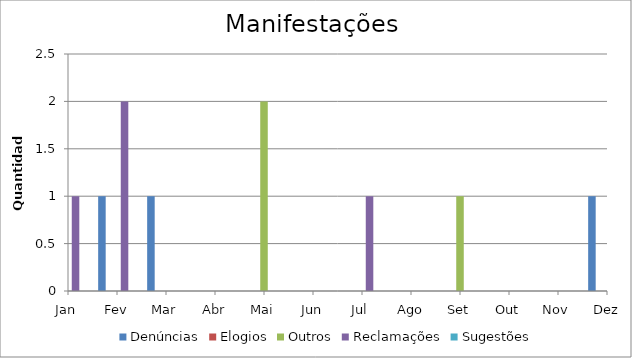
| Category | Denúncias | Elogios | Outros | Reclamações | Sugestões |
|---|---|---|---|---|---|
| Jan | 0 | 0 | 0 | 1 | 0 |
| Fev | 1 | 0 | 0 | 2 | 0 |
| Mar | 1 | 0 | 0 | 0 | 0 |
| Abr | 0 | 0 | 0 | 0 | 0 |
| Mai | 0 | 0 | 2 | 0 | 0 |
| Jun | 0 | 0 | 0 | 0 | 0 |
| Jul | 0 | 0 | 0 | 1 | 0 |
| Ago | 0 | 0 | 0 | 0 | 0 |
| Set | 0 | 0 | 1 | 0 | 0 |
| Out | 0 | 0 | 0 | 0 | 0 |
| Nov | 0 | 0 | 0 | 0 | 0 |
| Dez | 1 | 0 | 0 | 1 | 0 |